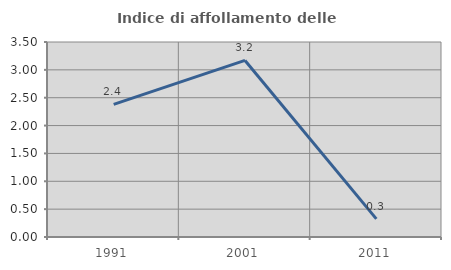
| Category | Indice di affollamento delle abitazioni  |
|---|---|
| 1991.0 | 2.381 |
| 2001.0 | 3.169 |
| 2011.0 | 0.325 |